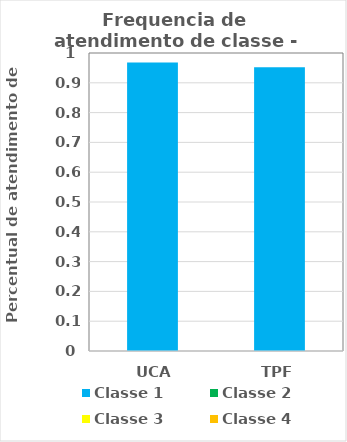
| Category | Classe 1 | Classe 2 | Classe 3 | Classe 4 |
|---|---|---|---|---|
| UCA | 0.968 | 0 | 0 | 0 |
| TPF | 0.952 | 0 | 0 | 0 |